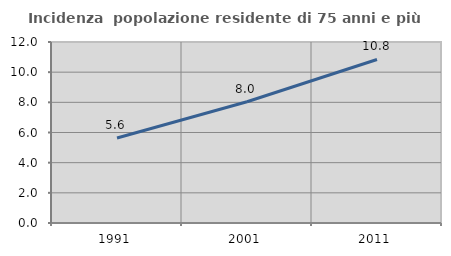
| Category | Incidenza  popolazione residente di 75 anni e più |
|---|---|
| 1991.0 | 5.635 |
| 2001.0 | 8.041 |
| 2011.0 | 10.841 |